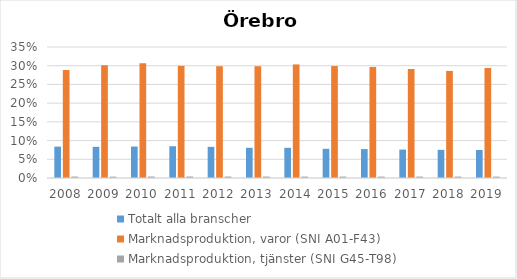
| Category | Totalt alla branscher | Marknadsproduktion, varor (SNI A01-F43) | Marknadsproduktion, tjänster (SNI G45-T98) |
|---|---|---|---|
| 2008.0 | 0.084 | 0.289 | 0.004 |
| 2009.0 | 0.083 | 0.301 | 0.004 |
| 2010.0 | 0.084 | 0.307 | 0.004 |
| 2011.0 | 0.085 | 0.3 | 0.004 |
| 2012.0 | 0.083 | 0.299 | 0.004 |
| 2013.0 | 0.081 | 0.299 | 0.004 |
| 2014.0 | 0.081 | 0.303 | 0.004 |
| 2015.0 | 0.078 | 0.299 | 0.004 |
| 2016.0 | 0.077 | 0.297 | 0.004 |
| 2017.0 | 0.076 | 0.291 | 0.004 |
| 2018.0 | 0.075 | 0.286 | 0.004 |
| 2019.0 | 0.075 | 0.294 | 0.004 |